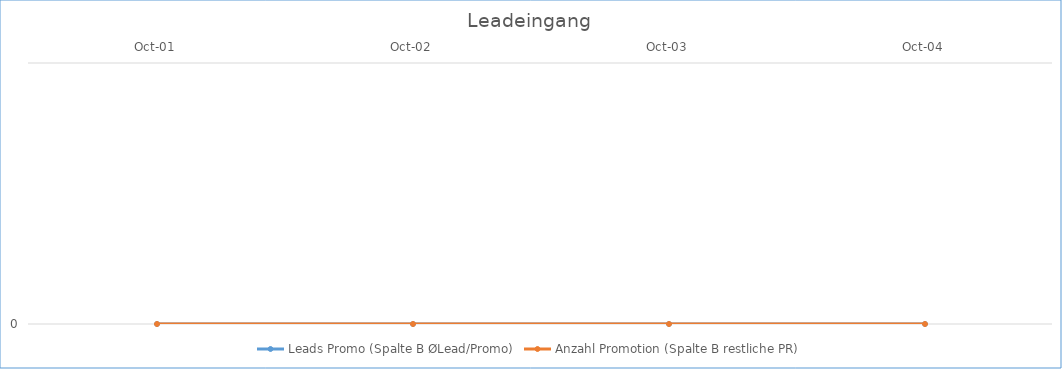
| Category | Leads Promo (Spalte B ØLead/Promo) | Anzahl Promotion (Spalte B restliche PR) |
|---|---|---|
| 2001-10-01 | 0 | 0 |
| 2002-10-01 | 0 | 0 |
| 2003-10-01 | 0 | 0 |
| 2004-10-01 | 0 | 0 |